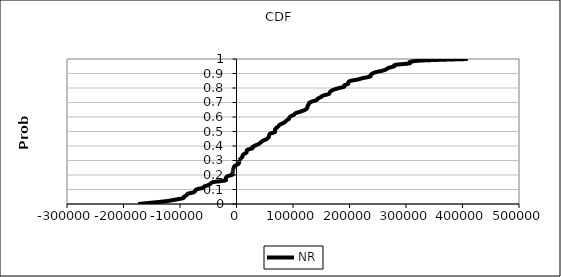
| Category | NR |
|---|---|
| -173923.30291541514 | 0 |
| -147293.0735334382 | 0.01 |
| -122913.36233144451 | 0.02 |
| -108158.49437888127 | 0.03 |
| -94298.74865018987 | 0.04 |
| -92861.44037939137 | 0.051 |
| -88335.51688409562 | 0.061 |
| -86289.63935244957 | 0.071 |
| -75796.82958203717 | 0.081 |
| -73029.22962050565 | 0.091 |
| -70814.27700013641 | 0.101 |
| -59448.67356896633 | 0.111 |
| -56806.43937087289 | 0.121 |
| -49550.90228948722 | 0.131 |
| -45690.397536386474 | 0.141 |
| -41141.36550598993 | 0.152 |
| -20337.08703461825 | 0.162 |
| -19488.061804836558 | 0.172 |
| -18677.18103169225 | 0.182 |
| -15575.58370727778 | 0.192 |
| -7414.070443917357 | 0.202 |
| -6926.257732478494 | 0.212 |
| -6789.903129995975 | 0.222 |
| -6784.627080668375 | 0.232 |
| -5439.571301926917 | 0.242 |
| -4787.075898514857 | 0.253 |
| -3155.918195863196 | 0.263 |
| 2163.062334143324 | 0.273 |
| 4419.426084261853 | 0.283 |
| 4803.387313967338 | 0.293 |
| 4805.876416443614 | 0.303 |
| 7006.797259585699 | 0.313 |
| 10160.497669992095 | 0.323 |
| 10708.744937700743 | 0.333 |
| 12906.224113654811 | 0.343 |
| 17573.314965061785 | 0.354 |
| 18018.30366092414 | 0.364 |
| 19111.107852767745 | 0.374 |
| 28124.00973315892 | 0.384 |
| 28422.577568779467 | 0.394 |
| 33631.1685001069 | 0.404 |
| 39392.82378180465 | 0.414 |
| 42852.36318697361 | 0.424 |
| 45951.51773064822 | 0.434 |
| 51610.24137818103 | 0.444 |
| 55446.72352613538 | 0.455 |
| 57388.91004499822 | 0.465 |
| 57766.016742099135 | 0.475 |
| 59378.240091072745 | 0.485 |
| 67702.60384394601 | 0.495 |
| 68000.90241903556 | 0.505 |
| 68394.57787513477 | 0.515 |
| 70653.38923267851 | 0.525 |
| 73995.781542563 | 0.535 |
| 76141.61570076726 | 0.545 |
| 81112.77226341586 | 0.556 |
| 86023.74166857393 | 0.566 |
| 88390.75153250445 | 0.576 |
| 92695.32336339494 | 0.586 |
| 93460.58010630868 | 0.596 |
| 96512.633429615 | 0.606 |
| 101944.25440447882 | 0.616 |
| 104374.9176006933 | 0.626 |
| 112510.15999471926 | 0.636 |
| 119774.93506416853 | 0.646 |
| 124137.49441027467 | 0.657 |
| 125589.3959294532 | 0.667 |
| 125961.40432425891 | 0.677 |
| 127925.88885389641 | 0.687 |
| 128369.81474048877 | 0.697 |
| 133810.0737388577 | 0.707 |
| 142187.4112529304 | 0.717 |
| 144012.3476675884 | 0.727 |
| 149249.0415235408 | 0.737 |
| 153033.85544900852 | 0.747 |
| 162849.072414762 | 0.758 |
| 164883.72043549782 | 0.768 |
| 166689.4765059544 | 0.778 |
| 171740.65020906832 | 0.788 |
| 179753.37145094096 | 0.798 |
| 190381.28376095428 | 0.808 |
| 190860.1155345763 | 0.818 |
| 197486.89496587525 | 0.828 |
| 197810.53327038302 | 0.838 |
| 200901.74771817122 | 0.848 |
| 214443.06080953375 | 0.859 |
| 224106.84831263602 | 0.869 |
| 236744.4218040895 | 0.879 |
| 237136.5210258828 | 0.889 |
| 240374.02740135335 | 0.899 |
| 246382.5177068223 | 0.909 |
| 258467.3701335159 | 0.919 |
| 265119.7781805517 | 0.929 |
| 269486.83414636226 | 0.939 |
| 279219.85578988213 | 0.949 |
| 281155.00967773516 | 0.96 |
| 306325.65565371164 | 0.97 |
| 307182.45450938947 | 0.98 |
| 328802.0357676663 | 0.99 |
| 409373.97570418695 | 1 |